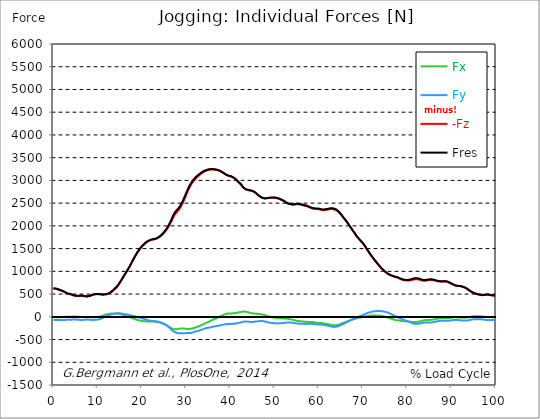
| Category |  Fx |  Fy |  -Fz |  Fres |
|---|---|---|---|---|
| 0.0 | -4.29 | -65.02 | 621.91 | 626.23 |
| 0.167348456675344 | -5.93 | -67.02 | 620.71 | 625.27 |
| 0.334696913350688 | -7.57 | -69.03 | 619.51 | 624.3 |
| 0.5020453700260321 | -8.74 | -70.77 | 617.01 | 622.08 |
| 0.669393826701376 | -9.56 | -72.19 | 613.73 | 619.03 |
| 0.83674228337672 | -9.38 | -72.67 | 608.57 | 613.97 |
| 1.0040907400520642 | -9.03 | -72.53 | 602.74 | 608.18 |
| 1.1621420602454444 | -8.96 | -72.85 | 597.28 | 602.83 |
| 1.3294905169207885 | -8.97 | -73.21 | 592.05 | 597.72 |
| 1.4968389735961325 | -8.66 | -73.21 | 586.63 | 592.36 |
| 1.6641874302714765 | -8.16 | -73.09 | 580.79 | 586.57 |
| 1.8315358869468206 | -7.57 | -73.04 | 574.4 | 580.24 |
| 1.9988843436221646 | -6.9 | -72.91 | 567.51 | 573.42 |
| 2.1662328002975086 | -6.14 | -72.54 | 559.27 | 565.2 |
| 2.333581256972853 | -5.22 | -71.52 | 552.4 | 558.28 |
| 2.5009297136481967 | -4.23 | -70.49 | 545.63 | 551.43 |
| 2.6682781703235405 | -2.36 | -68.2 | 536.83 | 542.43 |
| 2.8356266269988843 | 0.81 | -64.74 | 525.95 | 531.26 |
| 3.002975083674229 | 2.91 | -62.62 | 517.42 | 522.59 |
| 3.1703235403495724 | 3.88 | -61.9 | 511.18 | 516.3 |
| 3.337671997024917 | 4.25 | -61.84 | 506.43 | 511.59 |
| 3.4957233172182973 | 3.96 | -62.41 | 502.89 | 508.15 |
| 3.663071773893641 | 2.71 | -64.17 | 501.02 | 506.53 |
| 3.8304202305689854 | 2.61 | -64.5 | 496.88 | 502.48 |
| 3.997768687244329 | 3.6 | -63.46 | 491.05 | 496.56 |
| 4.165117143919673 | 4.48 | -62.72 | 484.72 | 490.17 |
| 4.332465600595017 | 6.09 | -61.55 | 477.76 | 483.15 |
| 4.499814057270361 | 7.08 | -60.46 | 471.74 | 477.02 |
| 4.667162513945706 | 7.26 | -59.78 | 467.21 | 472.43 |
| 4.834510970621049 | 6.86 | -59.73 | 463.83 | 469.03 |
| 5.001859427296393 | 6.13 | -60.1 | 461.09 | 466.31 |
| 5.169207883971737 | 5.22 | -60.88 | 458.82 | 464.12 |
| 5.336556340647081 | 4.1 | -61.92 | 457.35 | 462.77 |
| 5.503904797322425 | 2.76 | -62.94 | 456.67 | 462.17 |
| 5.671253253997769 | 1.24 | -64.53 | 456.49 | 462.2 |
| 5.82930457419115 | -0.73 | -66.71 | 457.9 | 463.92 |
| 5.996653030866494 | -2.94 | -69.06 | 460.11 | 466.49 |
| 6.164001487541838 | -4.85 | -70.4 | 461.04 | 467.59 |
| 6.331349944217181 | -6.03 | -70.65 | 460.68 | 467.26 |
| 6.498698400892526 | -6.35 | -69.86 | 459.78 | 466.23 |
| 6.66604685756787 | -6.41 | -68.69 | 458.7 | 464.97 |
| 6.833395314243213 | -5.87 | -67.1 | 456.02 | 462.06 |
| 7.000743770918558 | -4.65 | -64.93 | 451.81 | 457.58 |
| 7.168092227593902 | -3.76 | -63.32 | 448.8 | 454.34 |
| 7.335440684269246 | -3.43 | -62.44 | 447.64 | 453.08 |
| 7.50278914094459 | -3.4 | -61.91 | 447.93 | 453.25 |
| 7.6701375976199335 | -3.01 | -61.43 | 447.91 | 453.12 |
| 7.837486054295278 | -2.91 | -61.44 | 449.04 | 454.24 |
| 7.995537374488658 | -3.18 | -62.18 | 451.36 | 456.68 |
| 8.162885831164003 | -3.65 | -63.07 | 454.45 | 459.95 |
| 8.330234287839346 | -4.98 | -64.38 | 459.01 | 464.73 |
| 8.49758274451469 | -6.74 | -66.23 | 464.81 | 470.8 |
| 8.664931201190035 | -8.76 | -68.23 | 472.54 | 478.73 |
| 8.832279657865378 | -10.54 | -69.97 | 480.21 | 486.54 |
| 8.999628114540721 | -10.25 | -69.87 | 484.88 | 491.19 |
| 9.166976571216066 | -9.01 | -68.63 | 488.34 | 494.54 |
| 9.334325027891412 | -8.31 | -67.12 | 491.12 | 497.15 |
| 9.501673484566755 | -8.15 | -66.2 | 493.39 | 499.23 |
| 9.669021941242098 | -7.36 | -65.56 | 494.98 | 500.67 |
| 9.836370397917442 | -5.75 | -63.82 | 495.63 | 501.11 |
| 10.003718854592787 | -3.5 | -61.3 | 495.68 | 500.92 |
| 10.17106731126813 | -0.6 | -57.57 | 496.27 | 501.2 |
| 10.329118631461512 | 1.99 | -54.59 | 496.03 | 500.67 |
| 10.496467088136853 | 5.19 | -50.99 | 495.2 | 499.52 |
| 10.663815544812199 | 9.34 | -46.27 | 493.62 | 497.71 |
| 10.831164001487544 | 14.96 | -39.89 | 490.82 | 494.86 |
| 10.998512458162887 | 20.61 | -33.05 | 488.67 | 492.78 |
| 11.16586091483823 | 26.58 | -25.17 | 487.41 | 491.95 |
| 11.333209371513574 | 32.96 | -16.52 | 486.79 | 492.12 |
| 11.50055782818892 | 37.78 | -9.8 | 488.21 | 493.75 |
| 11.667906284864264 | 42.43 | -2.92 | 489.95 | 495.62 |
| 11.835254741539607 | 47.21 | 4.35 | 492.06 | 498.2 |
| 12.00260319821495 | 51.73 | 11.56 | 494.57 | 501.31 |
| 12.169951654890292 | 56.29 | 19.03 | 497.16 | 504.79 |
| 12.337300111565641 | 60.56 | 26.12 | 500.72 | 509.26 |
| 12.504648568240984 | 63.6 | 32.07 | 506.75 | 515.88 |
| 12.662699888434362 | 67.04 | 38.77 | 514.01 | 523.59 |
| 12.830048345109708 | 69.97 | 45.03 | 522.8 | 532.7 |
| 12.997396801785053 | 71.47 | 49.9 | 534.3 | 544.49 |
| 13.164745258460396 | 73.29 | 55.52 | 546.77 | 557.36 |
| 13.33209371513574 | 74.25 | 59.69 | 560.01 | 570.85 |
| 13.499442171811083 | 74.31 | 62.35 | 574.16 | 585.07 |
| 13.666790628486426 | 73.84 | 64.57 | 589.91 | 600.65 |
| 13.834139085161771 | 73.42 | 66.8 | 605.4 | 615.99 |
| 14.001487541837117 | 73.16 | 69.26 | 620.98 | 631.41 |
| 14.16883599851246 | 73.28 | 72.18 | 636.48 | 646.83 |
| 14.336184455187803 | 73.25 | 75.59 | 652.82 | 663.13 |
| 14.503532911863147 | 72.4 | 77.77 | 671.79 | 681.93 |
| 14.670881368538492 | 70.24 | 78.65 | 693.35 | 703.12 |
| 14.828932688731873 | 66.86 | 78.19 | 718.26 | 727.49 |
| 14.996281145407215 | 63.54 | 77.69 | 743.76 | 752.42 |
| 15.163629602082558 | 59.11 | 75.7 | 769.96 | 777.73 |
| 15.330978058757903 | 54.52 | 73.09 | 795.71 | 802.8 |
| 15.498326515433247 | 49.57 | 70.31 | 822.6 | 829.02 |
| 15.665674972108594 | 44.43 | 67.17 | 850 | 855.7 |
| 15.833023428783937 | 39 | 63.65 | 877.77 | 882.7 |
| 16.00037188545928 | 33.32 | 60.07 | 905.53 | 909.73 |
| 16.167720342134626 | 28.4 | 57.72 | 932.07 | 935.86 |
| 16.335068798809967 | 24.39 | 56.71 | 956.72 | 960.29 |
| 16.502417255485312 | 19.54 | 54.36 | 982.25 | 985.63 |
| 16.669765712160658 | 14.05 | 51.17 | 1008.67 | 1011.84 |
| 16.837114168836 | 7.92 | 47.6 | 1036.83 | 1039.68 |
| 17.004462625511344 | 1.81 | 43.45 | 1064.63 | 1067.27 |
| 17.16251394570472 | -4.36 | 39.41 | 1092.39 | 1094.89 |
| 17.32986240238007 | -10.71 | 35.36 | 1121.17 | 1123.57 |
| 17.497210859055414 | -17.31 | 31.62 | 1151.87 | 1154.18 |
| 17.664559315730756 | -22.98 | 28.32 | 1183.27 | 1185.58 |
| 17.8319077724061 | -28.79 | 25.02 | 1214.86 | 1217.19 |
| 17.999256229081443 | -34.86 | 21.19 | 1245.48 | 1247.91 |
| 18.166604685756788 | -40.79 | 17.36 | 1275.43 | 1277.9 |
| 18.333953142432133 | -46.71 | 13.74 | 1305.12 | 1307.67 |
| 18.501301599107478 | -52.44 | 9.65 | 1334.15 | 1336.79 |
| 18.668650055782823 | -58.08 | 5.02 | 1363.24 | 1365.99 |
| 18.835998512458165 | -63.68 | 0.4 | 1391.13 | 1394.04 |
| 19.00334696913351 | -68.79 | -3.95 | 1416.84 | 1419.92 |
| 19.170695425808855 | -72.88 | -7.63 | 1440.49 | 1443.77 |
| 19.338043882484197 | -76.99 | -12.56 | 1462.9 | 1466.4 |
| 19.496095202677576 | -80.86 | -17.44 | 1485.42 | 1489.13 |
| 19.66344365935292 | -84.64 | -22.64 | 1506.82 | 1510.8 |
| 19.830792116028263 | -88.47 | -27.36 | 1526.89 | 1531.04 |
| 19.998140572703612 | -91.66 | -32.29 | 1545.63 | 1549.99 |
| 20.165489029378953 | -93.71 | -36.98 | 1562.25 | 1566.76 |
| 20.3328374860543 | -95.71 | -41.84 | 1577.97 | 1582.68 |
| 20.500185942729644 | -97.24 | -46.08 | 1593.8 | 1598.68 |
| 20.667534399404985 | -98.67 | -51.16 | 1608.71 | 1613.79 |
| 20.83488285608033 | -100.21 | -57.62 | 1622.7 | 1628.09 |
| 21.002231312755672 | -101.4 | -63.58 | 1636.2 | 1641.84 |
| 21.16957976943102 | -101.82 | -68.42 | 1647.6 | 1653.32 |
| 21.336928226106362 | -101.95 | -72.9 | 1657.38 | 1663.14 |
| 21.504276682781704 | -101.94 | -76.49 | 1665.66 | 1671.51 |
| 21.67162513945705 | -101.97 | -79.89 | 1673.58 | 1679.57 |
| 21.82967645965043 | -102.55 | -83.25 | 1681.08 | 1687.18 |
| 21.997024916325774 | -102.74 | -86.7 | 1687.57 | 1693.78 |
| 22.16437337300112 | -102.44 | -89.76 | 1692.98 | 1699.26 |
| 22.33172182967646 | -102.42 | -91.59 | 1697.43 | 1703.78 |
| 22.499070286351806 | -102.96 | -93.5 | 1700.34 | 1706.83 |
| 22.666418743027148 | -103.66 | -95.11 | 1702.73 | 1709.34 |
| 22.833767199702496 | -104.54 | -96.59 | 1705.3 | 1712.03 |
| 23.00111565637784 | -106.41 | -97.44 | 1709.63 | 1716.52 |
| 23.168464113053183 | -109.01 | -99.64 | 1714.73 | 1721.89 |
| 23.335812569728528 | -111.94 | -101.75 | 1720.16 | 1727.62 |
| 23.50316102640387 | -115 | -103.36 | 1726.91 | 1734.69 |
| 23.670509483079215 | -117.64 | -106.97 | 1736.61 | 1744.75 |
| 23.83785793975456 | -120.71 | -112.14 | 1746.81 | 1755.37 |
| 23.995909259947936 | -123.94 | -116.99 | 1757.48 | 1766.49 |
| 24.163257716623285 | -127.83 | -120.8 | 1768.12 | 1777.56 |
| 24.330606173298627 | -133.12 | -125.63 | 1780.92 | 1791.04 |
| 24.49795462997397 | -138.73 | -131.54 | 1795.92 | 1806.79 |
| 24.665303086649313 | -144.8 | -138.83 | 1811.86 | 1823.71 |
| 24.83265154332466 | -151.4 | -147.27 | 1828.94 | 1841.93 |
| 25.0 | -158.5 | -156.11 | 1847.11 | 1861.33 |
| 25.167348456675345 | -166.05 | -164.31 | 1865.7 | 1881.2 |
| 25.334696913350694 | -173.82 | -172.63 | 1884.13 | 1900.97 |
| 25.502045370026035 | -182.26 | -181.92 | 1904.85 | 1923.22 |
| 25.669393826701377 | -190.9 | -192.3 | 1927.36 | 1947.41 |
| 25.836742283376722 | -199.65 | -204.6 | 1951.77 | 1973.76 |
| 26.004090740052067 | -209.12 | -217.9 | 1979.1 | 2003.21 |
| 26.17143919672741 | -219.29 | -233.47 | 2008.68 | 2035.3 |
| 26.329490516920792 | -230.09 | -248.52 | 2037.03 | 2066.21 |
| 26.49683897359613 | -240.83 | -263.46 | 2067.35 | 2099.16 |
| 26.66418743027148 | -250.87 | -279.41 | 2098.49 | 2133.08 |
| 26.831535886946828 | -259.1 | -295.52 | 2131.35 | 2168.53 |
| 26.998884343622166 | -265.44 | -309.9 | 2171.15 | 2210.44 |
| 27.166232800297514 | -273.06 | -321.87 | 2202.87 | 2244.1 |
| 27.333581256972852 | -276.33 | -330.45 | 2231.15 | 2273.47 |
| 27.5009297136482 | -277.07 | -337.48 | 2255.97 | 2298.93 |
| 27.668278170323543 | -276.24 | -343 | 2276.56 | 2319.86 |
| 27.835626626998888 | -274.5 | -348.18 | 2295.97 | 2339.5 |
| 28.002975083674233 | -270.58 | -354.06 | 2312.7 | 2356.35 |
| 28.170323540349575 | -266.53 | -359.83 | 2329.37 | 2373.11 |
| 28.33767199702492 | -263.4 | -361.97 | 2349.33 | 2392.73 |
| 28.50502045370026 | -260.74 | -363.29 | 2372.18 | 2415.11 |
| 28.663071773893645 | -258.32 | -362.89 | 2398.79 | 2440.95 |
| 28.830420230568986 | -256.95 | -364.71 | 2426.88 | 2468.73 |
| 28.99776868724433 | -256.09 | -363.99 | 2458.42 | 2499.57 |
| 29.165117143919673 | -255.27 | -363.59 | 2489.32 | 2529.86 |
| 29.33246560059502 | -256.68 | -364.17 | 2523.34 | 2563.55 |
| 29.499814057270367 | -258.26 | -363.12 | 2560.03 | 2599.68 |
| 29.66716251394571 | -260.23 | -362.39 | 2598.07 | 2637.2 |
| 29.834510970621054 | -262.56 | -360.53 | 2637.62 | 2676.07 |
| 30.00185942729639 | -264.98 | -358.97 | 2677.4 | 2715.22 |
| 30.169207883971744 | -266.5 | -358.7 | 2714.57 | 2751.92 |
| 30.33655634064708 | -268.03 | -357.97 | 2752.55 | 2789.38 |
| 30.50390479732243 | -269.03 | -357.83 | 2790.04 | 2826.45 |
| 30.671253253997772 | -269.07 | -357.81 | 2825.04 | 2860.99 |
| 30.829304574191156 | -266.47 | -356.54 | 2855.73 | 2890.89 |
| 30.996653030866494 | -263.79 | -354.47 | 2884.63 | 2918.99 |
| 31.164001487541842 | -260.68 | -351.44 | 2911.34 | 2944.81 |
| 31.331349944217187 | -257.09 | -348.21 | 2936.65 | 2969.13 |
| 31.498698400892525 | -253.33 | -344.62 | 2959.84 | 2991.38 |
| 31.666046857567874 | -249.44 | -340.09 | 2982.09 | 3012.62 |
| 31.833395314243212 | -245.22 | -334.21 | 3003.96 | 3033.3 |
| 32.00074377091856 | -239.72 | -327.64 | 3023.27 | 3051.27 |
| 32.1680922275939 | -233.69 | -323.31 | 3042.19 | 3069.05 |
| 32.33544068426925 | -228.54 | -318.87 | 3059.01 | 3084.92 |
| 32.50278914094459 | -222.86 | -314.29 | 3074.95 | 3099.89 |
| 32.670137597619934 | -217.23 | -310.02 | 3089.24 | 3113.27 |
| 32.83748605429528 | -210.5 | -305.52 | 3102.46 | 3125.51 |
| 33.004834510970625 | -203.83 | -300.42 | 3116.02 | 3138.08 |
| 33.162885831164004 | -196.18 | -294.97 | 3129.44 | 3150.37 |
| 33.33023428783935 | -188.53 | -289.66 | 3142.36 | 3162.23 |
| 33.497582744514695 | -181.02 | -284.51 | 3154.49 | 3173.43 |
| 33.664931201190036 | -173.87 | -279.44 | 3166.17 | 3184.22 |
| 33.83227965786538 | -166.57 | -274.02 | 3177.47 | 3194.57 |
| 33.99962811454073 | -157.95 | -266.5 | 3187.5 | 3203.55 |
| 34.16697657121607 | -149.11 | -259.19 | 3195.95 | 3210.99 |
| 34.33432502789141 | -141.44 | -253.67 | 3203.54 | 3217.76 |
| 34.50167348456676 | -135.38 | -250.73 | 3211.17 | 3224.83 |
| 34.6690219412421 | -128.73 | -246.97 | 3217.13 | 3230.24 |
| 34.83637039791744 | -121.66 | -243.49 | 3222.65 | 3235.2 |
| 35.00371885459279 | -115.01 | -240.75 | 3227.31 | 3239.41 |
| 35.17106731126814 | -108.47 | -239.18 | 3231.55 | 3243.26 |
| 35.338415767943474 | -100.13 | -235.47 | 3235.4 | 3246.47 |
| 35.49646708813686 | -91.84 | -231.71 | 3237.85 | 3248.38 |
| 35.6638155448122 | -83.8 | -227.9 | 3238.83 | 3248.89 |
| 35.831164001487544 | -75.71 | -223.66 | 3238.95 | 3248.54 |
| 35.998512458162885 | -67.37 | -219.28 | 3239 | 3248.12 |
| 36.165860914838234 | -59.23 | -214.96 | 3238.98 | 3247.66 |
| 36.333209371513576 | -53.15 | -211.7 | 3238.43 | 3246.82 |
| 36.50055782818892 | -46.97 | -209.36 | 3237.02 | 3245.14 |
| 36.667906284864266 | -39.98 | -207.74 | 3234.82 | 3242.67 |
| 36.83525474153961 | -31.82 | -204.75 | 3231.68 | 3239.17 |
| 37.002603198214956 | -23.74 | -201.65 | 3227.58 | 3234.81 |
| 37.1699516548903 | -16.2 | -199.04 | 3223.22 | 3230.29 |
| 37.337300111565646 | -9.49 | -195.91 | 3218.37 | 3225.33 |
| 37.50464856824098 | -1.83 | -192.8 | 3212.86 | 3219.64 |
| 37.66269988843437 | 6.01 | -189.35 | 3205.95 | 3212.53 |
| 37.83004834510971 | 13.57 | -185.49 | 3197.82 | 3204.23 |
| 37.99739680178505 | 20.88 | -182.62 | 3188.87 | 3195.18 |
| 38.16474525846039 | 28.3 | -179.25 | 3179.07 | 3185.29 |
| 38.33209371513574 | 35.87 | -175.18 | 3168.74 | 3174.85 |
| 38.49944217181109 | 43.04 | -171.35 | 3158.15 | 3164.17 |
| 38.666790628486424 | 49.92 | -167.78 | 3147.15 | 3153.11 |
| 38.83413908516178 | 56.57 | -164.22 | 3136.2 | 3142.12 |
| 39.001487541837115 | 62.56 | -161.33 | 3126.09 | 3132.01 |
| 39.16883599851246 | 66.91 | -158.85 | 3117.03 | 3122.97 |
| 39.336184455187805 | 69.51 | -156.63 | 3109.46 | 3115.4 |
| 39.503532911863154 | 72.57 | -155.36 | 3102.99 | 3108.99 |
| 39.670881368538495 | 74.08 | -155.63 | 3098.22 | 3104.27 |
| 39.83822982521384 | 73.42 | -157.21 | 3094.95 | 3101.04 |
| 39.996281145407224 | 72.77 | -158.05 | 3091.11 | 3097.23 |
| 40.163629602082565 | 72.7 | -156.72 | 3085.36 | 3091.42 |
| 40.33097805875791 | 74.07 | -154.8 | 3078.35 | 3084.34 |
| 40.498326515433256 | 75.01 | -153.6 | 3070.89 | 3076.88 |
| 40.6656749721086 | 76.48 | -153.56 | 3062.23 | 3068.2 |
| 40.83302342878393 | 77.68 | -153.17 | 3052.13 | 3058.04 |
| 41.00037188545929 | 79.7 | -151.82 | 3040.82 | 3046.7 |
| 41.16772034213463 | 82.58 | -149.66 | 3028.29 | 3034.16 |
| 41.33506879880997 | 85.6 | -146.68 | 3013.99 | 3019.83 |
| 41.50241725548531 | 90.06 | -143.36 | 2997.6 | 3003.4 |
| 41.66976571216066 | 94.53 | -139.76 | 2980.1 | 2985.83 |
| 41.837114168836 | 98.2 | -135.95 | 2963.24 | 2968.89 |
| 42.004462625511344 | 100.97 | -132.42 | 2947.77 | 2953.37 |
| 42.17181108218669 | 103.05 | -129.03 | 2932.69 | 2938.22 |
| 42.32986240238007 | 104.88 | -125.66 | 2917.57 | 2923.02 |
| 42.497210859055414 | 106.76 | -121.99 | 2899.95 | 2905.32 |
| 42.66455931573076 | 110.42 | -116.08 | 2876.75 | 2882 |
| 42.831907772406105 | 114.05 | -110.42 | 2853.89 | 2859.04 |
| 42.999256229081446 | 114.84 | -106.86 | 2836.99 | 2842.05 |
| 43.16660468575679 | 114.49 | -104.39 | 2823.81 | 2828.76 |
| 43.33395314243214 | 114.24 | -101.6 | 2811.71 | 2816.54 |
| 43.50130159910748 | 111.68 | -101.74 | 2803.23 | 2807.96 |
| 43.66865005578282 | 108.36 | -103.33 | 2796.37 | 2801.04 |
| 43.83599851245817 | 104.19 | -106.15 | 2791.35 | 2795.97 |
| 44.00334696913351 | 100.56 | -107.5 | 2786.46 | 2791.03 |
| 44.17069542580886 | 96.18 | -109.17 | 2783.13 | 2787.71 |
| 44.3380438824842 | 91.57 | -110.64 | 2780.29 | 2784.85 |
| 44.49609520267758 | 86.89 | -111.62 | 2777.6 | 2782.14 |
| 44.66344365935292 | 82.39 | -112.76 | 2774.8 | 2779.3 |
| 44.83079211602827 | 78.51 | -114.54 | 2771.71 | 2776.3 |
| 44.99814057270361 | 75.51 | -113.7 | 2766.74 | 2771.27 |
| 45.16548902937895 | 73.34 | -111.93 | 2759.4 | 2763.78 |
| 45.332837486054295 | 71.42 | -109.36 | 2750.65 | 2754.87 |
| 45.500185942729644 | 69.94 | -107.11 | 2740.53 | 2744.64 |
| 45.66753439940499 | 68.73 | -105.32 | 2729.1 | 2733.11 |
| 45.83488285608033 | 67.46 | -103.64 | 2716.48 | 2720.4 |
| 46.00223131275568 | 66.48 | -101.77 | 2701.92 | 2705.75 |
| 46.16957976943102 | 65.56 | -99.85 | 2687.01 | 2690.74 |
| 46.336928226106366 | 63.95 | -98.42 | 2673.72 | 2677.37 |
| 46.50427668278171 | 62.41 | -96.62 | 2660.88 | 2664.43 |
| 46.671625139457056 | 60.07 | -94.76 | 2648.98 | 2652.43 |
| 46.829676459650436 | 57.43 | -93.1 | 2637.67 | 2641.02 |
| 46.99702491632577 | 54.88 | -91.97 | 2627.58 | 2630.85 |
| 47.16437337300112 | 51.59 | -92.52 | 2619.55 | 2622.77 |
| 47.33172182967646 | 47.94 | -93.83 | 2612.48 | 2615.66 |
| 47.49907028635181 | 43.64 | -96.31 | 2607.77 | 2610.98 |
| 47.66641874302716 | 39.23 | -99.34 | 2604.51 | 2607.79 |
| 47.83376719970249 | 35.17 | -103.06 | 2602.99 | 2606.46 |
| 48.001115656377834 | 30.17 | -107.82 | 2604.02 | 2607.75 |
| 48.16846411305319 | 24.57 | -112.97 | 2605.41 | 2609.4 |
| 48.33581256972853 | 19.15 | -117.17 | 2607.87 | 2612.1 |
| 48.50316102640387 | 14.33 | -120.36 | 2610.04 | 2614.5 |
| 48.67050948307921 | 10.04 | -122.78 | 2611.74 | 2616.39 |
| 48.837857939754564 | 6.11 | -125.85 | 2613.64 | 2618.57 |
| 49.005206396429905 | 2.18 | -128.92 | 2615.19 | 2620.41 |
| 49.163257716623285 | -2.02 | -131.93 | 2616.22 | 2621.72 |
| 49.33060617329863 | -6.53 | -134.86 | 2616.72 | 2622.48 |
| 49.49795462997397 | -10.29 | -136.6 | 2616.44 | 2622.35 |
| 49.66530308664932 | -14.13 | -138.52 | 2616.75 | 2622.87 |
| 49.832651543324666 | -17.89 | -140.37 | 2617.75 | 2624.1 |
| 50.0 | -20.65 | -141.58 | 2617.04 | 2623.56 |
| 50.16734845667534 | -22.84 | -142.41 | 2615.27 | 2621.9 |
| 50.33469691335069 | -24.64 | -143.27 | 2612.37 | 2619.11 |
| 50.50204537002604 | -26.64 | -144.74 | 2608.94 | 2615.83 |
| 50.66939382670139 | -29.01 | -145.53 | 2606.37 | 2613.38 |
| 50.836742283376715 | -30.81 | -144.97 | 2602.07 | 2609.08 |
| 51.00409074005207 | -31.68 | -143.13 | 2595.98 | 2602.86 |
| 51.17143919672741 | -32.9 | -142 | 2589.32 | 2596.12 |
| 51.32949051692079 | -33.9 | -140.97 | 2581.87 | 2588.61 |
| 51.496838973596134 | -35.73 | -140.2 | 2574.46 | 2581.11 |
| 51.66418743027148 | -36.65 | -139.65 | 2568.2 | 2574.78 |
| 51.831535886946824 | -36.94 | -137.77 | 2560.46 | 2566.86 |
| 51.99888434362217 | -37.72 | -135.7 | 2551.81 | 2558.05 |
| 52.16623280029752 | -38.23 | -133.29 | 2541.63 | 2547.71 |
| 52.33358125697285 | -39.11 | -130.83 | 2528.99 | 2534.93 |
| 52.5009297136482 | -40.1 | -128.84 | 2518.09 | 2523.91 |
| 52.668278170323546 | -41.45 | -127.08 | 2507.93 | 2513.64 |
| 52.835626626998895 | -43.03 | -125.87 | 2498.6 | 2504.21 |
| 53.00297508367424 | -44.88 | -125.09 | 2491.29 | 2496.83 |
| 53.17032354034958 | -47.53 | -125.29 | 2485.56 | 2491.09 |
| 53.33767199702492 | -50.6 | -125.79 | 2481.47 | 2487.02 |
| 53.50502045370027 | -53.72 | -126.65 | 2478.8 | 2484.4 |
| 53.663071773893655 | -56.66 | -127.62 | 2474.22 | 2479.92 |
| 53.83042023056899 | -59.67 | -128.71 | 2470.16 | 2475.97 |
| 53.99776868724433 | -62.7 | -129.78 | 2467.39 | 2473.32 |
| 54.16511714391967 | -65.88 | -131.12 | 2466.2 | 2472.28 |
| 54.33246560059503 | -69.75 | -133.3 | 2467.3 | 2473.55 |
| 54.49981405727037 | -73.32 | -135.31 | 2469.62 | 2476.06 |
| 54.667162513945705 | -78.45 | -139.68 | 2473.86 | 2480.67 |
| 54.834510970621054 | -82.51 | -142.82 | 2476.71 | 2483.79 |
| 55.0018594272964 | -85.66 | -144.92 | 2477.59 | 2484.88 |
| 55.169207883971744 | -88.62 | -146.67 | 2477.1 | 2484.61 |
| 55.336556340647086 | -91.41 | -148.49 | 2476.44 | 2484.16 |
| 55.50390479732243 | -93.89 | -150.3 | 2475.48 | 2483.4 |
| 55.671253253997776 | -96.02 | -151.06 | 2474.18 | 2482.21 |
| 55.83860171067312 | -97.85 | -151.44 | 2471.48 | 2479.61 |
| 55.9966530308665 | -99.63 | -152.01 | 2467.37 | 2475.58 |
| 56.16400148754184 | -101.32 | -153.26 | 2462.73 | 2471.09 |
| 56.33134994421718 | -102.73 | -154.24 | 2457.83 | 2466.3 |
| 56.498698400892536 | -103.89 | -154.42 | 2452.29 | 2460.84 |
| 56.66604685756788 | -105.49 | -154.95 | 2448.43 | 2457.06 |
| 56.83339531424321 | -107.23 | -155.67 | 2445.81 | 2454.61 |
| 57.00074377091856 | -108.77 | -156.25 | 2442.76 | 2451.68 |
| 57.16809222759391 | -110.34 | -156.32 | 2439 | 2447.99 |
| 57.33544068426925 | -111.49 | -155.92 | 2434.44 | 2443.45 |
| 57.5027891409446 | -112.13 | -155.41 | 2427.76 | 2436.77 |
| 57.670137597619934 | -112.12 | -154.76 | 2420.32 | 2429.33 |
| 57.83748605429528 | -111.91 | -154.04 | 2412.52 | 2421.51 |
| 58.004834510970625 | -112.1 | -153.29 | 2405.31 | 2414.29 |
| 58.16288583116401 | -112.54 | -152.69 | 2398.23 | 2407.2 |
| 58.330234287839346 | -113.71 | -152.9 | 2390.67 | 2399.68 |
| 58.497582744514695 | -115.41 | -154.6 | 2385.69 | 2394.83 |
| 58.66493120119004 | -117.73 | -156.41 | 2382.12 | 2391.34 |
| 58.832279657865385 | -119.41 | -157.76 | 2378.69 | 2388.04 |
| 58.999628114540734 | -121.17 | -159.42 | 2375.77 | 2385.29 |
| 59.16697657121607 | -123.54 | -161.74 | 2373.73 | 2383.49 |
| 59.33432502789142 | -126.15 | -164.11 | 2372.52 | 2382.5 |
| 59.50167348456676 | -128.3 | -165.68 | 2371.91 | 2382.06 |
| 59.66902194124211 | -130.43 | -167.3 | 2371.08 | 2381.41 |
| 59.83637039791745 | -132.46 | -169.08 | 2369.26 | 2379.81 |
| 60.00371885459278 | -134.06 | -170.16 | 2367.2 | 2377.91 |
| 60.17106731126813 | -135.62 | -171.1 | 2364.79 | 2375.64 |
| 60.33841576794349 | -136.93 | -171.2 | 2360.38 | 2371.35 |
| 60.49646708813685 | -137.99 | -171.59 | 2355.88 | 2366.94 |
| 60.6638155448122 | -139 | -172.05 | 2351.35 | 2362.51 |
| 60.831164001487544 | -141.11 | -173.65 | 2348.91 | 2360.28 |
| 60.99851245816289 | -143.55 | -175.99 | 2348.58 | 2360.23 |
| 61.16586091483824 | -146.11 | -178.96 | 2349.99 | 2361.96 |
| 61.333209371513576 | -148.7 | -182.2 | 2351.62 | 2363.91 |
| 61.50055782818892 | -151.24 | -185.19 | 2352.62 | 2365.24 |
| 61.667906284864266 | -153.98 | -187.92 | 2353.75 | 2366.71 |
| 61.835254741539615 | -157.04 | -190.96 | 2355.28 | 2368.65 |
| 62.002603198214956 | -160.56 | -195.14 | 2357.68 | 2371.57 |
| 62.16995165489029 | -164.33 | -199.17 | 2361.27 | 2375.68 |
| 62.33730011156564 | -168.07 | -203.65 | 2365.29 | 2380.29 |
| 62.504648568240995 | -171.67 | -208.07 | 2369.08 | 2384.67 |
| 62.67199702491633 | -174.92 | -211.03 | 2370.85 | 2386.91 |
| 62.83004834510971 | -178.34 | -214.68 | 2372.12 | 2388.77 |
| 62.99739680178505 | -180.66 | -216.87 | 2370.89 | 2387.91 |
| 63.1647452584604 | -182.82 | -219.05 | 2368.99 | 2386.39 |
| 63.33209371513575 | -184.87 | -221.43 | 2366.19 | 2383.99 |
| 63.4994421718111 | -186.35 | -222.55 | 2361.89 | 2379.94 |
| 63.666790628486424 | -186.53 | -221.99 | 2356.05 | 2374.12 |
| 63.83413908516177 | -185.33 | -220.23 | 2348.61 | 2366.53 |
| 64.00148754183712 | -183.07 | -217.35 | 2339.6 | 2357.19 |
| 64.16883599851248 | -180.8 | -214.22 | 2328.52 | 2345.76 |
| 64.3361844551878 | -177.54 | -209.52 | 2315.37 | 2332.06 |
| 64.50353291186315 | -173.04 | -202.9 | 2300.8 | 2316.68 |
| 64.6708813685385 | -167.55 | -195.91 | 2284.85 | 2299.86 |
| 64.83822982521384 | -161.51 | -188.67 | 2267.87 | 2281.98 |
| 65.00557828188919 | -155.56 | -181.12 | 2249.36 | 2262.63 |
| 65.16362960208257 | -149.51 | -173.44 | 2230.4 | 2242.83 |
| 65.3309780587579 | -143.1 | -165.33 | 2209.93 | 2221.48 |
| 65.49832651543326 | -135.91 | -156.68 | 2188.48 | 2199.11 |
| 65.6656749721086 | -129.28 | -148.53 | 2167.9 | 2177.65 |
| 65.83302342878395 | -123.43 | -141.52 | 2148.78 | 2157.79 |
| 66.00037188545929 | -117.82 | -134.38 | 2129.62 | 2137.92 |
| 66.16772034213463 | -112.11 | -126.95 | 2109.52 | 2117.15 |
| 66.33506879880998 | -106.02 | -118.94 | 2088.16 | 2095.11 |
| 66.50241725548531 | -99.73 | -110.49 | 2065.64 | 2071.9 |
| 66.66976571216065 | -93.52 | -102.13 | 2042.83 | 2048.45 |
| 66.83711416883601 | -87.44 | -93.79 | 2019.36 | 2024.41 |
| 67.00446262551135 | -81.42 | -85.42 | 1994.86 | 1999.38 |
| 67.1718110821867 | -75.49 | -77.14 | 1971.04 | 1975.04 |
| 67.32986240238007 | -70.36 | -69.35 | 1948.43 | 1951.99 |
| 67.49721085905541 | -65.33 | -61.64 | 1925.16 | 1928.38 |
| 67.66455931573076 | -60.42 | -54.16 | 1901.45 | 1904.38 |
| 67.83190777240611 | -55.43 | -46.59 | 1877.98 | 1880.61 |
| 67.99925622908145 | -50.69 | -39.32 | 1854.32 | 1856.71 |
| 68.16660468575678 | -46.35 | -32.09 | 1829.99 | 1832.17 |
| 68.33395314243214 | -41.8 | -24.91 | 1806.89 | 1808.86 |
| 68.50130159910749 | -37.21 | -17.69 | 1784.16 | 1785.98 |
| 68.66865005578282 | -32.91 | -10.77 | 1762.9 | 1764.54 |
| 68.83599851245816 | -28.72 | -4.07 | 1743.51 | 1744.97 |
| 69.00334696913352 | -24.54 | 2.6 | 1725.47 | 1726.73 |
| 69.17069542580886 | -20.55 | 9.27 | 1706.7 | 1707.85 |
| 69.3380438824842 | -16.65 | 15.81 | 1687.59 | 1688.74 |
| 69.50539233915956 | -12.97 | 22.11 | 1669.72 | 1670.92 |
| 69.66344365935292 | -9.36 | 28.34 | 1652.23 | 1653.48 |
| 69.83079211602826 | -5.79 | 34.65 | 1634.28 | 1635.62 |
| 69.99814057270362 | -2.3 | 41.1 | 1615.54 | 1617.02 |
| 70.16548902937896 | 1.01 | 47.65 | 1593.88 | 1595.59 |
| 70.33283748605429 | 4.83 | 54.83 | 1571.13 | 1573.16 |
| 70.50018594272964 | 8.37 | 61.79 | 1547.39 | 1549.74 |
| 70.667534399405 | 11.72 | 68.08 | 1522.06 | 1524.76 |
| 70.83488285608033 | 15.31 | 74.52 | 1496.22 | 1499.36 |
| 71.00223131275568 | 18.74 | 80.95 | 1470.45 | 1474.08 |
| 71.16957976943102 | 21.33 | 86.53 | 1446.06 | 1450.17 |
| 71.33692822610637 | 23.78 | 91.91 | 1421.48 | 1426.09 |
| 71.50427668278171 | 25.9 | 96.97 | 1397.32 | 1402.44 |
| 71.67162513945706 | 27.58 | 101.72 | 1373.23 | 1378.79 |
| 71.8389735961324 | 28.89 | 106.06 | 1349.59 | 1355.62 |
| 71.99702491632577 | 29.98 | 110.15 | 1326.9 | 1333.4 |
| 72.16437337300113 | 30.8 | 113.94 | 1304.66 | 1311.56 |
| 72.33172182967647 | 31.32 | 117.15 | 1283.04 | 1290.31 |
| 72.49907028635181 | 31.84 | 120.16 | 1261.7 | 1269.3 |
| 72.66641874302715 | 31.74 | 122.13 | 1241.01 | 1248.82 |
| 72.8337671997025 | 31.53 | 123.86 | 1220.57 | 1228.58 |
| 73.00111565637783 | 31.24 | 125.41 | 1200.2 | 1208.38 |
| 73.16846411305319 | 30.65 | 126.61 | 1179.69 | 1188.01 |
| 73.33581256972853 | 30.02 | 127.11 | 1160.2 | 1168.61 |
| 73.50316102640387 | 29.02 | 127.03 | 1140.88 | 1149.3 |
| 73.67050948307921 | 27.32 | 126.56 | 1121.14 | 1129.53 |
| 73.83785793975457 | 25.63 | 125.97 | 1100.79 | 1109.12 |
| 74.00520639642991 | 23.58 | 124.59 | 1081.49 | 1089.67 |
| 74.16325771662328 | 21.18 | 122.9 | 1064.77 | 1072.76 |
| 74.33060617329863 | 19.21 | 121.67 | 1047.92 | 1055.79 |
| 74.49795462997398 | 16.49 | 120 | 1031.5 | 1039.24 |
| 74.66530308664932 | 12.36 | 117.09 | 1017.29 | 1024.79 |
| 74.83265154332466 | 8.18 | 113.56 | 1004.66 | 1011.91 |
| 75.00000000000001 | 4.22 | 110.83 | 991.02 | 998.12 |
| 75.16734845667534 | -0.25 | 107.41 | 978.09 | 984.99 |
| 75.3346969133507 | -5.27 | 102.51 | 965.65 | 972.13 |
| 75.50204537002605 | -10.51 | 96.78 | 953.36 | 959.28 |
| 75.66939382670138 | -15.84 | 90.87 | 942.32 | 947.79 |
| 75.83674228337672 | -21.72 | 84.78 | 933.13 | 938.29 |
| 76.00409074005208 | -27.99 | 78.17 | 925.04 | 930.02 |
| 76.17143919672742 | -34.5 | 70.33 | 917.71 | 922.67 |
| 76.33878765340276 | -40.84 | 61.87 | 910.69 | 915.7 |
| 76.49683897359614 | -46.75 | 53.51 | 903.93 | 908.99 |
| 76.66418743027148 | -51.69 | 45.96 | 897.05 | 902.34 |
| 76.83153588694682 | -56.14 | 38.59 | 890.11 | 895.67 |
| 76.99888434362218 | -61.12 | 29.99 | 884.3 | 890.09 |
| 77.16623280029752 | -66.18 | 21.63 | 879.4 | 885.53 |
| 77.33358125697285 | -70.09 | 13.69 | 874.99 | 881.72 |
| 77.5009297136482 | -73.62 | 5.32 | 871.07 | 878.34 |
| 77.66827817032356 | -77.3 | -3.68 | 867.39 | 875.07 |
| 77.83562662699889 | -80.32 | -10.85 | 861.65 | 869.62 |
| 78.00297508367423 | -82.24 | -16.85 | 855.38 | 863.73 |
| 78.17032354034959 | -84.54 | -23.85 | 848.36 | 857.11 |
| 78.33767199702493 | -84.28 | -28.19 | 838.76 | 847.67 |
| 78.50502045370027 | -86.78 | -35.31 | 831.23 | 840.41 |
| 78.67236891037561 | -90.66 | -43.03 | 823.88 | 833.27 |
| 78.83042023056899 | -93.36 | -51.17 | 817.92 | 827.82 |
| 78.99776868724433 | -95.3 | -58.45 | 813.04 | 823.42 |
| 79.16511714391969 | -97.36 | -65.51 | 808.8 | 819.57 |
| 79.33246560059503 | -99.01 | -71.61 | 805.21 | 816.29 |
| 79.49981405727036 | -99.58 | -76.18 | 802.54 | 814.03 |
| 79.66716251394571 | -100.33 | -81.71 | 800.5 | 812.65 |
| 79.83451097062107 | -101.53 | -87.92 | 798.57 | 811.56 |
| 80.00185942729641 | -102.79 | -94.23 | 796.65 | 810.51 |
| 80.16920788397174 | -103.11 | -99.1 | 796.21 | 810.83 |
| 80.33655634064709 | -104.28 | -104.94 | 797.23 | 812.71 |
| 80.50390479732243 | -105.8 | -111.11 | 799.42 | 815.83 |
| 80.67125325399778 | -107.31 | -117.29 | 801.88 | 819.22 |
| 80.83860171067312 | -109.19 | -123.87 | 804.99 | 823.37 |
| 80.99665303086651 | -111.21 | -130.43 | 808.75 | 828.19 |
| 81.16400148754184 | -113.45 | -137.04 | 813.57 | 834.17 |
| 81.3313499442172 | -115.78 | -143.75 | 818.82 | 840.63 |
| 81.49869840089255 | -116.91 | -148.89 | 821.48 | 843.99 |
| 81.66604685756786 | -116.8 | -151.87 | 823.4 | 846.21 |
| 81.83339531424322 | -116.79 | -154.9 | 825.04 | 848.3 |
| 82.00074377091858 | -115.03 | -155.59 | 825.69 | 848.8 |
| 82.16809222759392 | -112.43 | -154.87 | 825.98 | 848.67 |
| 82.33544068426926 | -110.47 | -154.79 | 824.68 | 847.17 |
| 82.50278914094459 | -107.46 | -152.99 | 822.15 | 844.01 |
| 82.67013759761994 | -104.04 | -150.95 | 818.75 | 839.97 |
| 82.83748605429528 | -100.2 | -147.71 | 814.99 | 835.36 |
| 83.00483451097062 | -96.28 | -144.89 | 810.66 | 830.27 |
| 83.17218296764597 | -91.77 | -140.62 | 805.51 | 824.15 |
| 83.33023428783935 | -87.03 | -135.71 | 800.09 | 817.66 |
| 83.4975827445147 | -82.81 | -131.95 | 795.29 | 812 |
| 83.66493120119004 | -79.25 | -129.12 | 791.76 | 807.85 |
| 83.83227965786537 | -76.18 | -125.92 | 790.98 | 806.5 |
| 83.99962811454073 | -73.79 | -123.63 | 791.9 | 806.9 |
| 84.16697657121607 | -72.49 | -123.01 | 793.92 | 808.72 |
| 84.33432502789142 | -71.52 | -122.89 | 796.47 | 811.15 |
| 84.50167348456677 | -71.18 | -123.73 | 799.6 | 814.34 |
| 84.6690219412421 | -71.25 | -125.31 | 803.47 | 818.43 |
| 84.83637039791745 | -70.85 | -126.21 | 806.97 | 821.93 |
| 85.0037188545928 | -70.11 | -126.67 | 809.9 | 824.75 |
| 85.17106731126813 | -68.88 | -126.51 | 811.45 | 826.06 |
| 85.33841576794349 | -67.21 | -126.17 | 812.4 | 826.66 |
| 85.50576422461883 | -65.35 | -124.68 | 811.28 | 825.14 |
| 85.66381554481221 | -63.43 | -122.7 | 809.33 | 822.76 |
| 85.83116400148755 | -61.23 | -120.33 | 807.15 | 820.03 |
| 85.99851245816289 | -58.77 | -117.71 | 804.46 | 816.77 |
| 86.16586091483823 | -55.73 | -114.06 | 800.99 | 812.54 |
| 86.33320937151358 | -53.01 | -110.66 | 797 | 807.93 |
| 86.50055782818893 | -48.71 | -105.74 | 791.96 | 801.89 |
| 86.66790628486427 | -44.96 | -101.6 | 787.7 | 796.81 |
| 86.83525474153961 | -42.04 | -98.53 | 784.27 | 792.79 |
| 87.00260319821496 | -39.65 | -96.28 | 781.39 | 789.46 |
| 87.16995165489031 | -37.46 | -94.13 | 778.81 | 786.44 |
| 87.33730011156564 | -35.17 | -91.52 | 776.47 | 783.54 |
| 87.504648568241 | -33.2 | -88.97 | 774.56 | 781.13 |
| 87.67199702491634 | -31.58 | -86.97 | 773.41 | 779.57 |
| 87.83004834510972 | -31.03 | -86.55 | 773.34 | 779.36 |
| 87.99739680178506 | -30.14 | -85.42 | 774.16 | 779.93 |
| 88.1647452584604 | -30.58 | -86.43 | 775.64 | 781.51 |
| 88.33209371513574 | -31.05 | -87.5 | 776.87 | 782.85 |
| 88.49944217181108 | -31.18 | -88.09 | 776.95 | 782.98 |
| 88.66679062848644 | -31.74 | -89.18 | 776.79 | 782.96 |
| 88.83413908516178 | -32 | -89.96 | 775.79 | 782.06 |
| 89.00148754183712 | -31.27 | -89.46 | 772.21 | 778.39 |
| 89.16883599851246 | -30.26 | -88.6 | 767.31 | 773.33 |
| 89.33618445518782 | -28.56 | -86.41 | 761.08 | 766.81 |
| 89.50353291186315 | -26.68 | -84.6 | 753.12 | 758.66 |
| 89.6708813685385 | -24.6 | -82.9 | 744.68 | 750.06 |
| 89.83822982521386 | -22.2 | -80.54 | 736.69 | 741.78 |
| 90.00557828188919 | -19.95 | -78.3 | 728.7 | 733.55 |
| 90.16362960208257 | -17.21 | -75.37 | 720.01 | 724.53 |
| 90.3309780587579 | -15.11 | -73.03 | 711.72 | 716 |
| 90.49832651543326 | -13.07 | -70.75 | 704.03 | 708.06 |
| 90.66567497210859 | -11.2 | -68.91 | 697.44 | 701.29 |
| 90.83302342878395 | -9.99 | -67.68 | 691.01 | 694.74 |
| 91.00037188545929 | -9.26 | -66.93 | 685.18 | 688.84 |
| 91.16772034213463 | -9.52 | -67.25 | 681.14 | 684.84 |
| 91.33506879880998 | -10.3 | -68.27 | 678.35 | 682.16 |
| 91.50241725548533 | -11.31 | -69.87 | 676.75 | 680.74 |
| 91.66976571216065 | -13.21 | -72.79 | 675.88 | 680.19 |
| 91.83711416883601 | -14.88 | -75.21 | 674.65 | 679.23 |
| 92.00446262551137 | -15.97 | -76.73 | 672.26 | 677.04 |
| 92.1718110821867 | -16.73 | -78.39 | 668.64 | 673.67 |
| 92.33915953886203 | -17.76 | -80.08 | 664.7 | 670 |
| 92.49721085905541 | -18.41 | -81.3 | 660.09 | 665.6 |
| 92.66455931573077 | -18.74 | -82.28 | 654.61 | 660.3 |
| 92.83190777240611 | -18.78 | -83.06 | 648.64 | 654.5 |
| 92.99925622908145 | -18.72 | -83.79 | 642.4 | 648.41 |
| 93.1666046857568 | -18.34 | -84.16 | 635.32 | 641.44 |
| 93.33395314243214 | -16.62 | -82.64 | 626.35 | 632.32 |
| 93.50130159910749 | -14.23 | -80.58 | 616.44 | 622.22 |
| 93.66865005578283 | -11.86 | -78.82 | 605.87 | 611.51 |
| 93.83599851245818 | -9.06 | -76.05 | 594.8 | 600.22 |
| 94.00334696913353 | -5.46 | -72.6 | 582.72 | 587.88 |
| 94.17069542580886 | -1.9 | -69.09 | 571.04 | 576 |
| 94.3380438824842 | 1.29 | -65.77 | 560.02 | 564.77 |
| 94.50539233915954 | 4.34 | -62.35 | 549.44 | 553.92 |
| 94.66344365935292 | 6.66 | -59.64 | 540.09 | 544.35 |
| 94.83079211602828 | 8.27 | -57.71 | 531.69 | 535.79 |
| 94.99814057270362 | 9.41 | -56.22 | 524.52 | 528.53 |
| 95.16548902937897 | 10.27 | -55.06 | 518.27 | 522.22 |
| 95.33283748605432 | 10.87 | -54.59 | 512.57 | 516.51 |
| 95.50018594272963 | 11.35 | -53.96 | 507.11 | 511 |
| 95.66753439940499 | 11.71 | -53.25 | 501.93 | 505.77 |
| 95.83488285608034 | 12.03 | -52.53 | 496.95 | 500.78 |
| 96.00223131275567 | 12.03 | -51.78 | 492.37 | 496.16 |
| 96.16957976943102 | 11.78 | -51.34 | 488.1 | 491.87 |
| 96.33692822610638 | 11.12 | -51.46 | 484.39 | 488.21 |
| 96.50427668278171 | 10.29 | -52.14 | 481.26 | 485.19 |
| 96.67162513945706 | 9.28 | -53.02 | 478.43 | 482.51 |
| 96.8389735961324 | 8.05 | -54.06 | 476.46 | 480.71 |
| 96.99702491632577 | 6.63 | -55.33 | 475.87 | 480.29 |
| 97.16437337300111 | 4.8 | -57.54 | 476.22 | 480.94 |
| 97.33172182967647 | 2.56 | -60.74 | 477.36 | 482.49 |
| 97.49907028635181 | 0.61 | -62.86 | 478.17 | 483.56 |
| 97.66641874302715 | -2.2 | -65.64 | 480.97 | 486.8 |
| 97.8337671997025 | -4.92 | -68.36 | 483.44 | 489.67 |
| 98.00111565637785 | -7.37 | -70.83 | 484.96 | 491.52 |
| 98.16846411305319 | -8.51 | -71.56 | 484.11 | 490.81 |
| 98.33581256972855 | -9.56 | -72.95 | 482.46 | 489.44 |
| 98.50316102640389 | -10.26 | -73.64 | 480.73 | 487.86 |
| 98.67050948307921 | -10.16 | -73.39 | 478.39 | 485.46 |
| 98.83785793975456 | -9.89 | -73.04 | 475.22 | 482.23 |
| 99.0052063964299 | -9.54 | -72.64 | 472.06 | 479 |
| 99.17255485310525 | -9.22 | -72.22 | 469.31 | 476.15 |
| 99.33060617329863 | -9.27 | -71.94 | 466.99 | 473.75 |
| 99.49795462997399 | -9.32 | -71.73 | 464.84 | 471.54 |
| 99.66530308664933 | -9.51 | -71.86 | 463.16 | 469.83 |
| 99.83265154332467 | -9.91 | -72.3 | 462.02 | 468.7 |
| 100.0 | -10.42 | -72.79 | 461.14 | 467.85 |